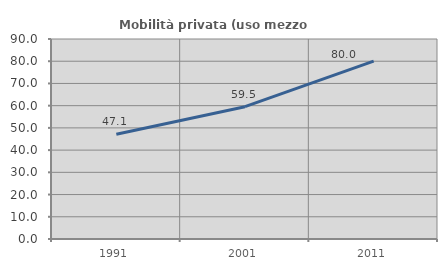
| Category | Mobilità privata (uso mezzo privato) |
|---|---|
| 1991.0 | 47.148 |
| 2001.0 | 59.543 |
| 2011.0 | 80.026 |